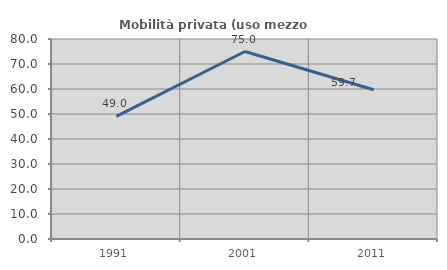
| Category | Mobilità privata (uso mezzo privato) |
|---|---|
| 1991.0 | 49.038 |
| 2001.0 | 75 |
| 2011.0 | 59.722 |